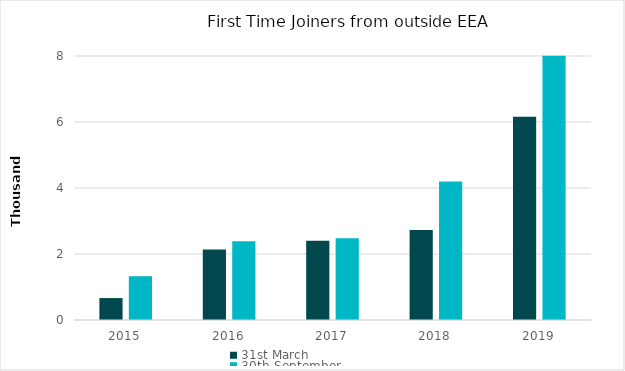
| Category | 31st March | 30th September |
|---|---|---|
| 2015.0 | 665 | 1323 |
| 2016.0 | 2135 | 2389 |
| 2017.0 | 2403 | 2475 |
| 2018.0 | 2724 | 4196 |
| 2019.0 | 6157 | 8011 |